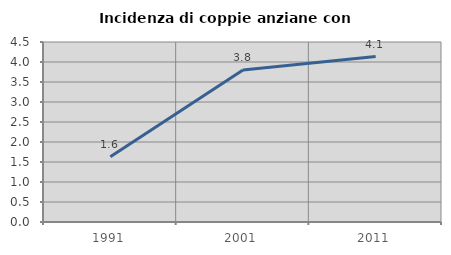
| Category | Incidenza di coppie anziane con figli |
|---|---|
| 1991.0 | 1.629 |
| 2001.0 | 3.801 |
| 2011.0 | 4.136 |